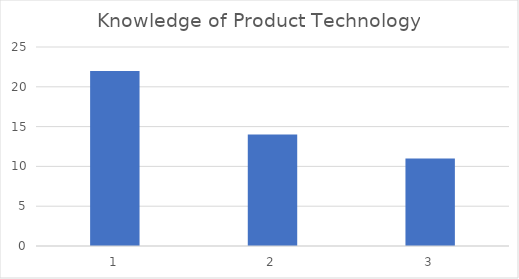
| Category | Knowledge of Product Technology |
|---|---|
| 0 | 22 |
| 1 | 14 |
| 2 | 11 |